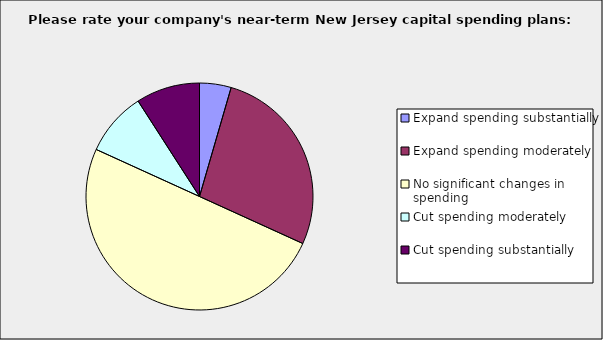
| Category | Series 0 |
|---|---|
| Expand spending substantially | 0.045 |
| Expand spending moderately | 0.273 |
| No significant changes in spending | 0.5 |
| Cut spending moderately | 0.091 |
| Cut spending substantially | 0.091 |